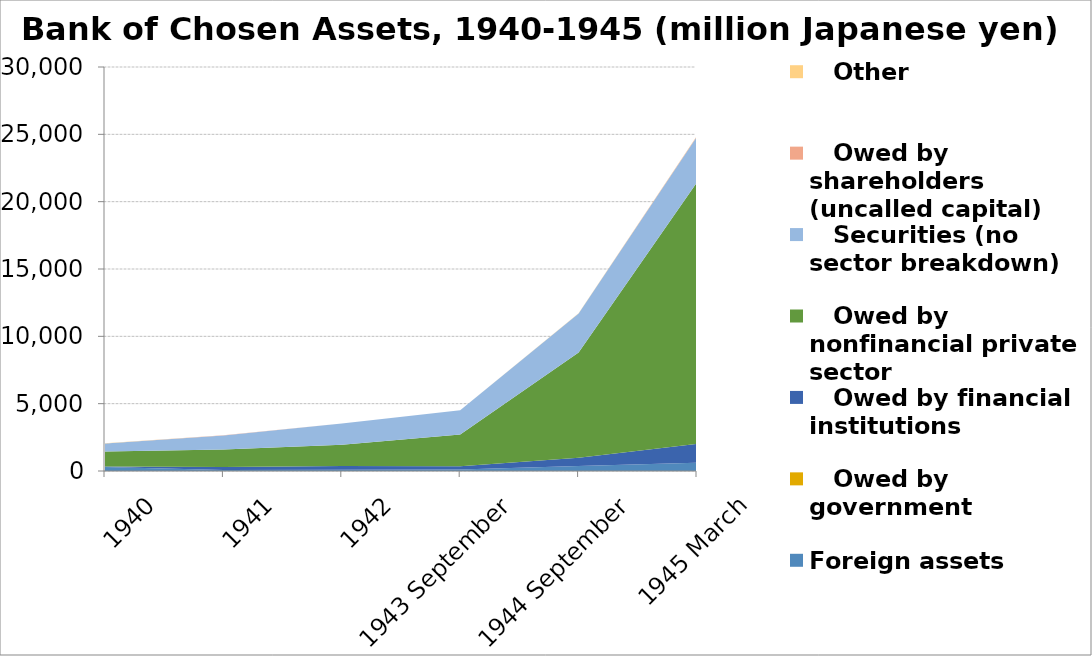
| Category | Foreign assets |    Owed by government |    Owed by financial institutions |    Owed by nonfinancial private sector |    Securities (no sector breakdown) |    Owed by shareholders (uncalled capital) |    Other |
|---|---|---|---|---|---|---|---|
| 1940 | 305689694 | 0 | 35772369 | 1102733552 | 594661636 | 5000000 | 9499230 |
| 1941 | 64990864 | 0 | 237154802 | 1286263670 | 1056305057 | 5000000 | 9858736 |
| 1942 | 89143346 | 0 | 282979949 | 1576553849 | 1572851286 | 0 | 11945678 |
| 1943 September | 114435024 | 0 | 240350731 | 2353044509 | 1794232882 | 0 | 12760596 |
| 1944 September | 364568657 | 0 | 617514243 | 7814937517 | 2903243187 | 0 | 15795109 |
| 1945 March | 617167591 | 0 | 1399012192 | 19424223206 | 3399989272 | 30000000 | 21731214 |